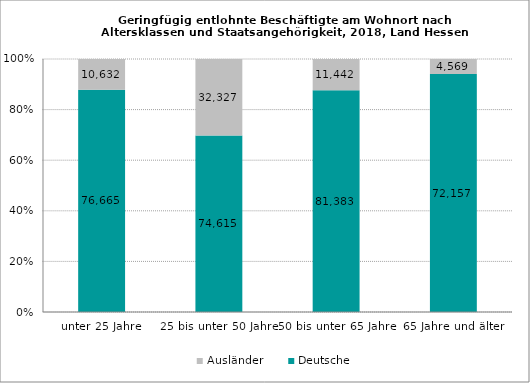
| Category | Deutsche | Ausländer |
|---|---|---|
| unter 25 Jahre | 76665 | 10632 |
| 25 bis unter 50 Jahre | 74615 | 32327 |
| 50 bis unter 65 Jahre | 81383 | 11442 |
| 65 Jahre und älter | 72157 | 4569 |